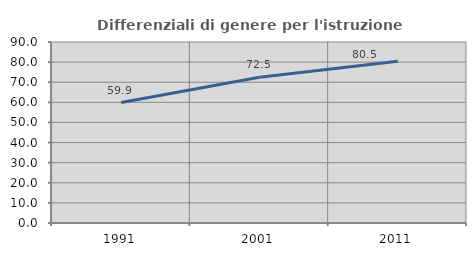
| Category | Differenziali di genere per l'istruzione superiore |
|---|---|
| 1991.0 | 59.907 |
| 2001.0 | 72.471 |
| 2011.0 | 80.455 |